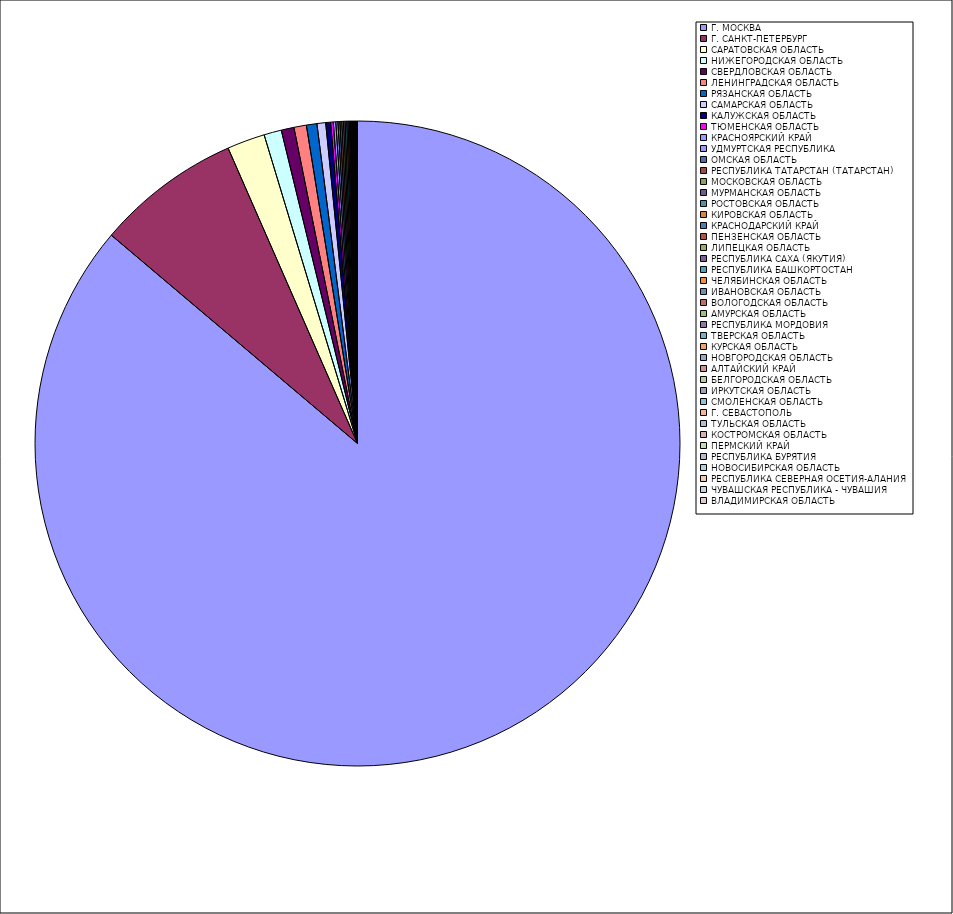
| Category | Оборот |
|---|---|
| Г. МОСКВА | 86.147 |
| Г. САНКТ-ПЕТЕРБУРГ | 7.25 |
| САРАТОВСКАЯ ОБЛАСТЬ | 1.895 |
| НИЖЕГОРОДСКАЯ ОБЛАСТЬ | 0.876 |
| СВЕРДЛОВСКАЯ ОБЛАСТЬ | 0.639 |
| ЛЕНИНГРАДСКАЯ ОБЛАСТЬ | 0.624 |
| РЯЗАНСКАЯ ОБЛАСТЬ | 0.525 |
| САМАРСКАЯ ОБЛАСТЬ | 0.436 |
| КАЛУЖСКАЯ ОБЛАСТЬ | 0.243 |
| ТЮМЕНСКАЯ ОБЛАСТЬ | 0.133 |
| КРАСНОЯРСКИЙ КРАЙ | 0.125 |
| УДМУРТСКАЯ РЕСПУБЛИКА | 0.104 |
| ОМСКАЯ ОБЛАСТЬ | 0.099 |
| РЕСПУБЛИКА ТАТАРСТАН (ТАТАРСТАН) | 0.093 |
| МОСКОВСКАЯ ОБЛАСТЬ | 0.084 |
| МУРМАНСКАЯ ОБЛАСТЬ | 0.081 |
| РОСТОВСКАЯ ОБЛАСТЬ | 0.08 |
| КИРОВСКАЯ ОБЛАСТЬ | 0.063 |
| КРАСНОДАРСКИЙ КРАЙ | 0.062 |
| ПЕНЗЕНСКАЯ ОБЛАСТЬ | 0.044 |
| ЛИПЕЦКАЯ ОБЛАСТЬ | 0.042 |
| РЕСПУБЛИКА САХА (ЯКУТИЯ) | 0.037 |
| РЕСПУБЛИКА БАШКОРТОСТАН | 0.037 |
| ЧЕЛЯБИНСКАЯ ОБЛАСТЬ | 0.036 |
| ИВАНОВСКАЯ ОБЛАСТЬ | 0.026 |
| ВОЛОГОДСКАЯ ОБЛАСТЬ | 0.026 |
| АМУРСКАЯ ОБЛАСТЬ | 0.02 |
| РЕСПУБЛИКА МОРДОВИЯ | 0.017 |
| ТВЕРСКАЯ ОБЛАСТЬ | 0.017 |
| КУРСКАЯ ОБЛАСТЬ | 0.01 |
| НОВГОРОДСКАЯ ОБЛАСТЬ | 0.009 |
| АЛТАЙСКИЙ КРАЙ | 0.009 |
| БЕЛГОРОДСКАЯ ОБЛАСТЬ | 0.008 |
| ИРКУТСКАЯ ОБЛАСТЬ | 0.007 |
| СМОЛЕНСКАЯ ОБЛАСТЬ | 0.007 |
| Г. СЕВАСТОПОЛЬ | 0.007 |
| ТУЛЬСКАЯ ОБЛАСТЬ | 0.007 |
| КОСТРОМСКАЯ ОБЛАСТЬ | 0.007 |
| ПЕРМСКИЙ КРАЙ | 0.006 |
| РЕСПУБЛИКА БУРЯТИЯ | 0.006 |
| НОВОСИБИРСКАЯ ОБЛАСТЬ | 0.006 |
| РЕСПУБЛИКА СЕВЕРНАЯ ОСЕТИЯ-АЛАНИЯ | 0.005 |
| ЧУВАШСКАЯ РЕСПУБЛИКА - ЧУВАШИЯ | 0.005 |
| ВЛАДИМИРСКАЯ ОБЛАСТЬ | 0.005 |